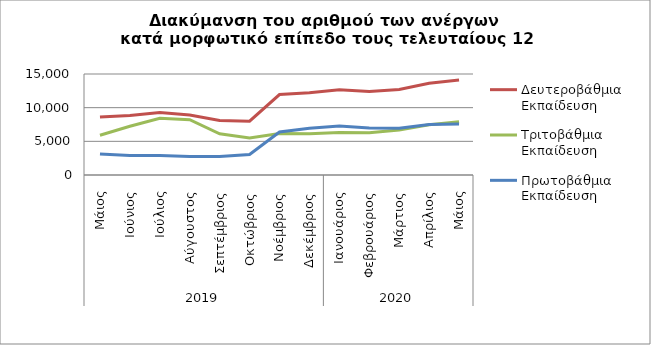
| Category | Δευτεροβάθμια Εκπαίδευση | Τριτοβάθμια Εκπαίδευση | Πρωτοβάθμια Εκπαίδευση |
|---|---|---|---|
| 0 | 8603 | 5896 | 3108 |
| 1 | 8822 | 7231 | 2907 |
| 2 | 9270 | 8411 | 2901 |
| 3 | 8918 | 8210 | 2755 |
| 4 | 8096 | 6115 | 2757 |
| 5 | 7999 | 5505 | 3040 |
| 6 | 11945 | 6155 | 6395 |
| 7 | 12223 | 6111 | 6951 |
| 8 | 12645 | 6303 | 7266 |
| 9 | 12391 | 6258 | 6971 |
| 10 | 12702 | 6691 | 6960 |
| 11 | 13630 | 7456 | 7505 |
| 12 | 14114 | 7899 | 7591 |